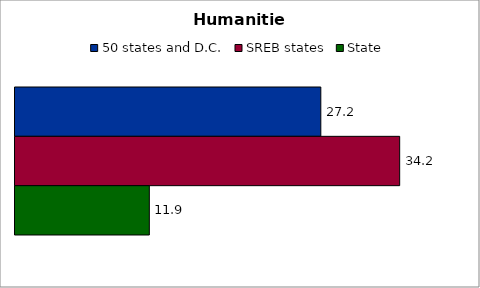
| Category | 50 states and D.C. | SREB states | State |
|---|---|---|---|
| Humanities | 27.184 | 34.194 | 11.941 |